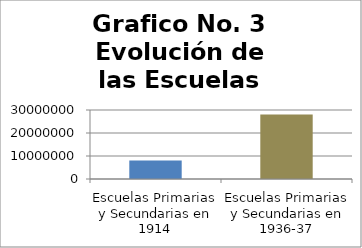
| Category | EVOLUCION DE LAS ESCUELAS |
|---|---|
| Escuelas Primarias y Secundarias en 1914 | 8000000 |
| Escuelas Primarias y Secundarias en 1936-37 | 28000000 |